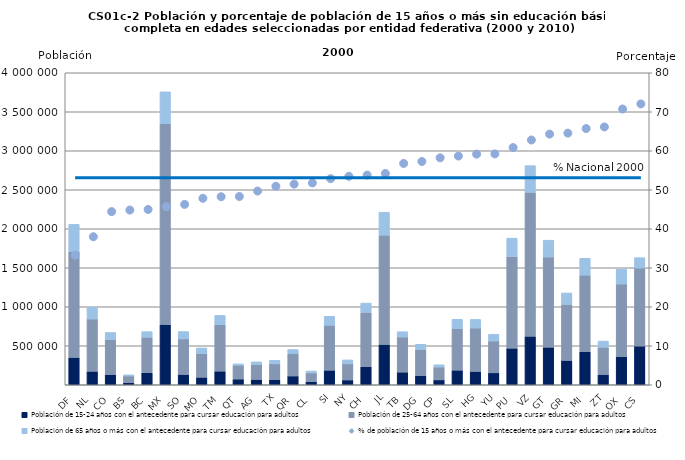
| Category | Población de 15-24 años con el antecedente para cursar educación para adultos | Población de 25-64 años con el antecedente para cursar educación para adultos | Población de 65 años o más con el antecedente para cursar educación para adultos |
|---|---|---|---|
| DF | 350456 | 1355528 | 350748 |
| NL | 172418 | 671219 | 150700 |
| CO | 128956 | 450236 | 91306 |
| BS | 26996 | 86031 | 14081 |
| BC | 154386 | 453897 | 73007 |
| MX | 771993 | 2574231 | 409269 |
| SO | 132015 | 456319 | 94115 |
| MO | 95514 | 304239 | 72109 |
| TM | 174807 | 595020 | 119162 |
| QT | 73385 | 176604 | 17768 |
| AG | 67180 | 190473 | 36070 |
| TX | 64518 | 203347 | 46197 |
| QR | 112904 | 288690 | 50232 |
| CL | 38900 | 113123 | 24330 |
| SI | 185970 | 576367 | 115863 |
| NY | 61893 | 206251 | 50923 |
| CH | 232013 | 694437 | 121082 |
| JL | 516143 | 1400489 | 296132 |
| TB | 162028 | 449364 | 68976 |
| DG | 117471 | 332472 | 69154 |
| CP | 63006 | 164414 | 29042 |
| SL | 186727 | 534442 | 118856 |
| HG | 171153 | 555809 | 110866 |
| YU | 153170 | 407947 | 86873 |
| PU | 468833 | 1172631 | 238796 |
| VZ | 621010 | 1844954 | 343855 |
| GT | 480926 | 1157243 | 215469 |
| GR | 312145 | 715890 | 148855 |
| MI | 424744 | 980834 | 216243 |
| ZT | 130783 | 349669 | 79712 |
| OX | 361103 | 930900 | 191176 |
| CS | 496014 | 1000775 | 132911 |